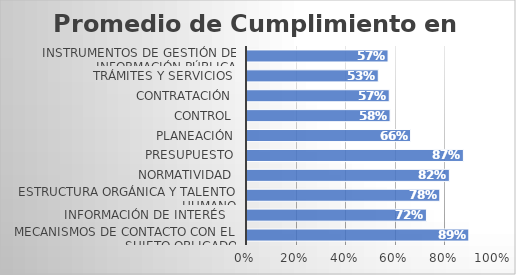
| Category | Series 0 |
|---|---|
| Mecanismos de contacto con el sujeto obligado | 0.894 |
| Información de interés   | 0.724 |
| Estructura orgánica y talento humano | 0.777 |
| Normatividad | 0.816 |
| Presupuesto | 0.873 |
| Planeación | 0.66 |
| Control | 0.577 |
| Contratación | 0.574 |
| Trámites y servicios | 0.529 |
| Instrumentos de gestión de información pública | 0.569 |